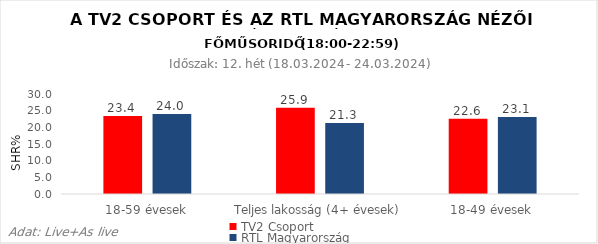
| Category | TV2 Csoport | RTL Magyarország |
|---|---|---|
| 18-59 évesek | 23.4 | 24 |
| Teljes lakosság (4+ évesek) | 25.9 | 21.3 |
| 18-49 évesek | 22.6 | 23.1 |